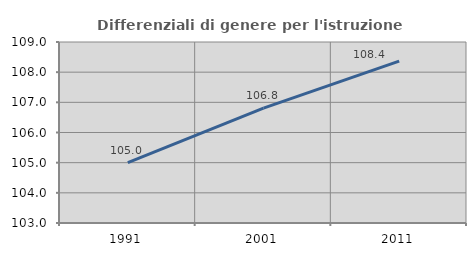
| Category | Differenziali di genere per l'istruzione superiore |
|---|---|
| 1991.0 | 105.004 |
| 2001.0 | 106.809 |
| 2011.0 | 108.367 |